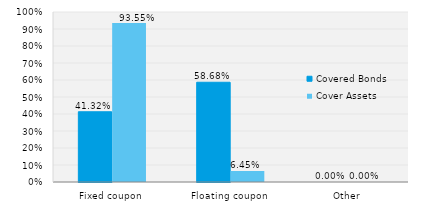
| Category | Covered Bonds | Cover Assets |
|---|---|---|
| Fixed coupon | 0.413 | 0.936 |
| Floating coupon | 0.587 | 0.064 |
| Other | 0 | 0 |